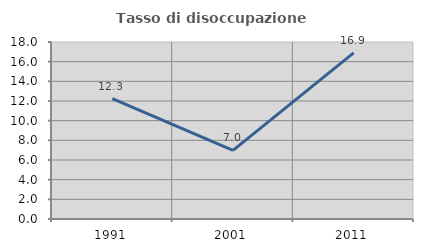
| Category | Tasso di disoccupazione giovanile  |
|---|---|
| 1991.0 | 12.251 |
| 2001.0 | 6.987 |
| 2011.0 | 16.901 |